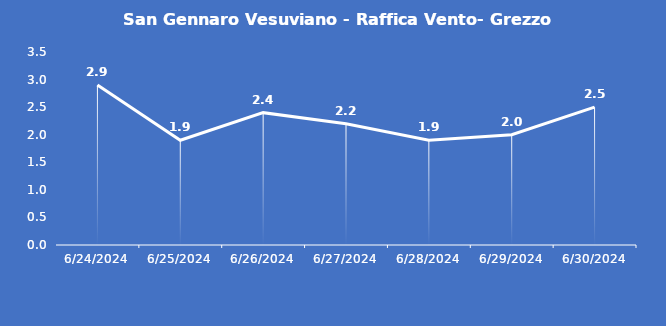
| Category | San Gennaro Vesuviano - Raffica Vento- Grezzo (m/s) |
|---|---|
| 6/24/24 | 2.9 |
| 6/25/24 | 1.9 |
| 6/26/24 | 2.4 |
| 6/27/24 | 2.2 |
| 6/28/24 | 1.9 |
| 6/29/24 | 2 |
| 6/30/24 | 2.5 |